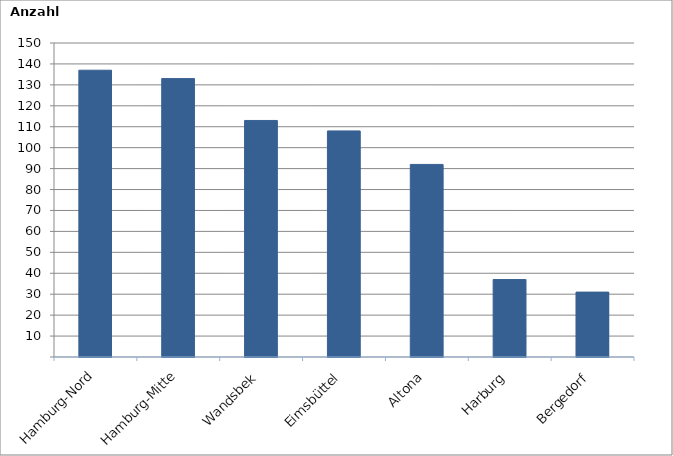
| Category | Series 0 |
|---|---|
| Hamburg-Nord | 137 |
| Hamburg-Mitte | 133 |
| Wandsbek | 113 |
| Eimsbüttel | 108 |
| Altona | 92 |
| Harburg | 37 |
| Bergedorf | 31 |